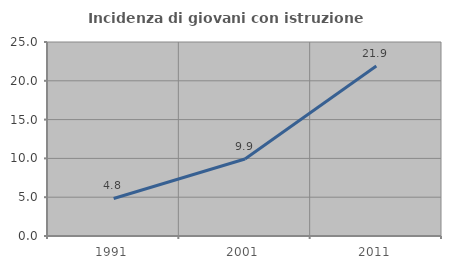
| Category | Incidenza di giovani con istruzione universitaria |
|---|---|
| 1991.0 | 4.839 |
| 2001.0 | 9.917 |
| 2011.0 | 21.918 |